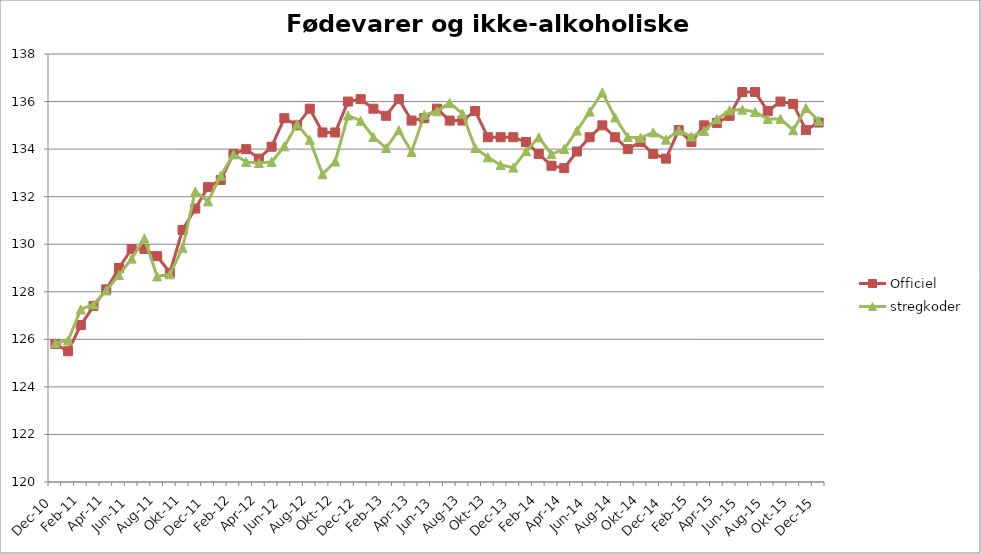
| Category | Officiel | stregkoder |
|---|---|---|
|  Dec-10 | 125.8 | 125.842 |
|  Jan-11 | 125.5 | 125.95 |
|  Feb-11 | 126.6 | 127.259 |
|  Mar-11 | 127.4 | 127.464 |
|  Apr-11 | 128.1 | 128.056 |
|  Maj-11 | 129 | 128.7 |
|  Jun-11 | 129.8 | 129.395 |
|  Jul-11 | 129.8 | 130.244 |
|  Aug-11 | 129.5 | 128.645 |
|  Sep-11 | 128.8 | 128.734 |
|  Okt-11 | 130.6 | 129.848 |
|  Nov-11 | 131.5 | 132.219 |
|  Dec-11 | 132.4 | 131.801 |
|  Jan-12 | 132.7 | 132.884 |
|  Feb-12 | 133.8 | 133.781 |
|  Mar-12 | 134 | 133.462 |
|  Apr-12 | 133.6 | 133.415 |
|  Maj-12 | 134.1 | 133.46 |
|  Jun-12 | 135.3 | 134.118 |
|  Jul-12 | 135 | 135.051 |
|  Aug-12 | 135.7 | 134.391 |
|  Sep-12 | 134.7 | 132.941 |
|  Okt-12 | 134.7 | 133.48 |
|  Nov-12 | 136 | 135.414 |
|  Dec-12 | 136.1 | 135.19 |
|  Jan-13 | 135.7 | 134.508 |
|  Feb-13 | 135.4 | 134.044 |
|  Mar-13 | 136.1 | 134.796 |
|  Apr-13 | 135.2 | 133.881 |
|  Maj-13 | 135.3 | 135.441 |
|  Jun-13 | 135.7 | 135.592 |
|  Jul-13 | 135.2 | 135.942 |
|  Aug-13 | 135.2 | 135.494 |
|  Sep-13 | 135.6 | 134.048 |
|  Okt-13 | 134.5 | 133.656 |
|  Nov-13 | 134.5 | 133.334 |
|  Dec-13 | 134.5 | 133.222 |
|  Jan-14 | 134.3 | 133.913 |
|  Feb-14 | 133.8 | 134.497 |
|  Mar-14 | 133.3 | 133.79 |
|  Apr-14 | 133.2 | 134.003 |
|  Maj-14 | 133.9 | 134.78 |
|  Jun-14 | 134.5 | 135.576 |
|  Jul-14 | 135 | 136.38 |
|  Aug-14 | 134.5 | 135.331 |
|  Sep-14 | 134 | 134.509 |
|  Okt-14 | 134.3 | 134.477 |
|  Nov-14 | 133.8 | 134.703 |
|  Dec-14 | 133.6 | 134.398 |
|  Jan-15 | 134.8 | 134.78 |
|  Feb-15 | 134.3 | 134.531 |
|  Mar-15 | 135 | 134.766 |
|  Apr-15 | 135.1 | 135.259 |
|  Maj-15 | 135.4 | 135.627 |
| Jun-15 | 136.4 | 135.661 |
| Jul-15 | 136.4 | 135.564 |
| Aug-15 | 135.6 | 135.267 |
| Sep-15 | 136 | 135.271 |
| Okt-15 | 135.9 | 134.794 |
| Nov-15 | 134.8 | 135.733 |
| Dec-15 | 135.118 | 135.19 |